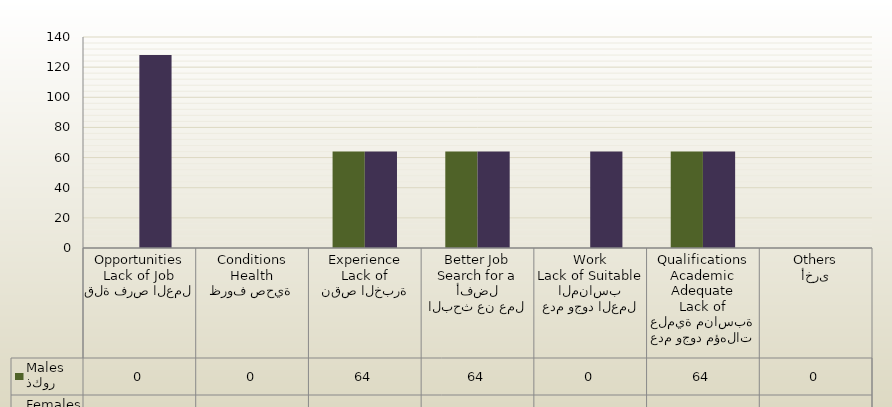
| Category | ذكور
Males | اناث
Females |
|---|---|---|
| قلة فرص العمل
Lack of Job Opportunities | 0 | 128 |
| ظروف صحية
Health Conditions | 0 | 0 |
| نقص الخبرة
Lack of Experience | 64 | 64 |
| البحث عن عمل أفضل
Search for a Better Job | 64 | 64 |
| عدم وجود العمل المناسب
Lack of Suitable Work | 0 | 64 |
| عدم وجود مؤهلات علمية مناسبة
Lack of Adequate Academic Qualifications | 64 | 64 |
| أخرى
Others | 0 | 0 |